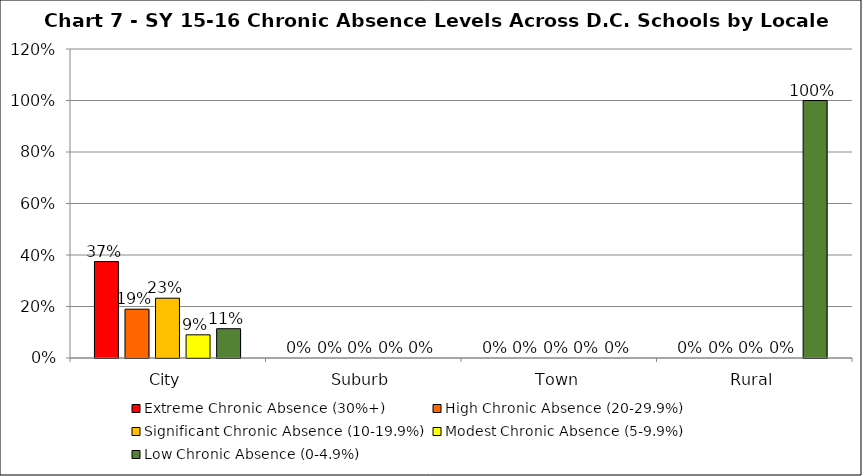
| Category | Extreme Chronic Absence (30%+) | High Chronic Absence (20-29.9%) | Significant Chronic Absence (10-19.9%) | Modest Chronic Absence (5-9.9%) | Low Chronic Absence (0-4.9%) |
|---|---|---|---|---|---|
| 0 | 0.374 | 0.19 | 0.232 | 0.09 | 0.114 |
| 1 | 0 | 0 | 0 | 0 | 0 |
| 2 | 0 | 0 | 0 | 0 | 0 |
| 3 | 0 | 0 | 0 | 0 | 1 |